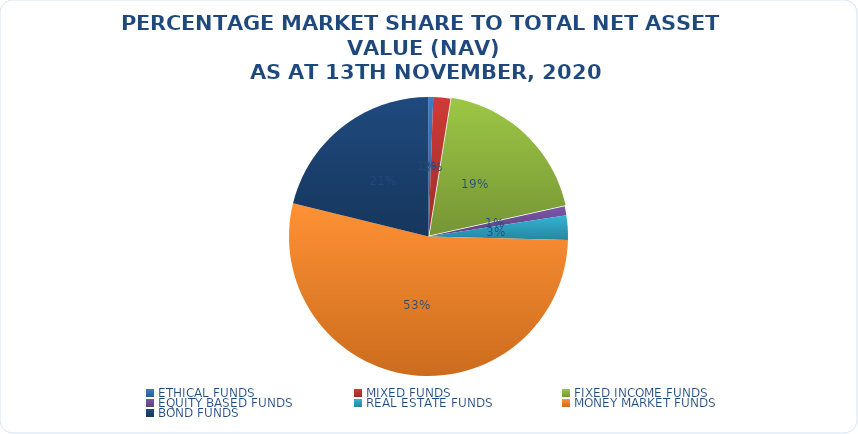
| Category | NET ASSET VALUE |
|---|---|
| ETHICAL FUNDS | 8036206520.53 |
| MIXED FUNDS | 29554978877.7 |
| FIXED INCOME FUNDS | 282844255018.625 |
| EQUITY BASED FUNDS | 15493832478.31 |
| REAL ESTATE FUNDS | 42226005382.159 |
| MONEY MARKET FUNDS | 795709860514.287 |
| BOND FUNDS | 315039788955.54 |